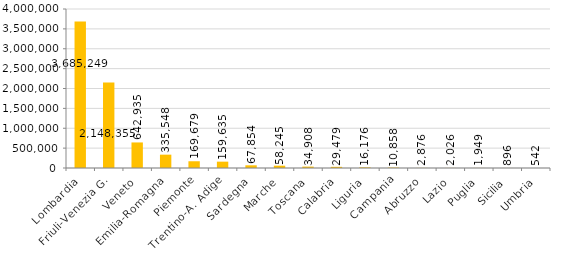
| Category | Series 0 |
|---|---|
| Lombardia | 3685249 |
| Friuli-Venezia G. | 2148355 |
| Veneto | 642935 |
| Emilia-Romagna | 335548 |
| Piemonte | 169679 |
| Trentino-A. Adige | 159635 |
| Sardegna | 67854 |
| Marche | 58245 |
| Toscana | 34908 |
| Calabria | 29479 |
| Liguria | 16176 |
| Campania | 10858 |
| Abruzzo | 2876 |
| Lazio | 2026 |
| Puglia | 1949 |
| Sicilia | 896 |
| Umbria | 542 |